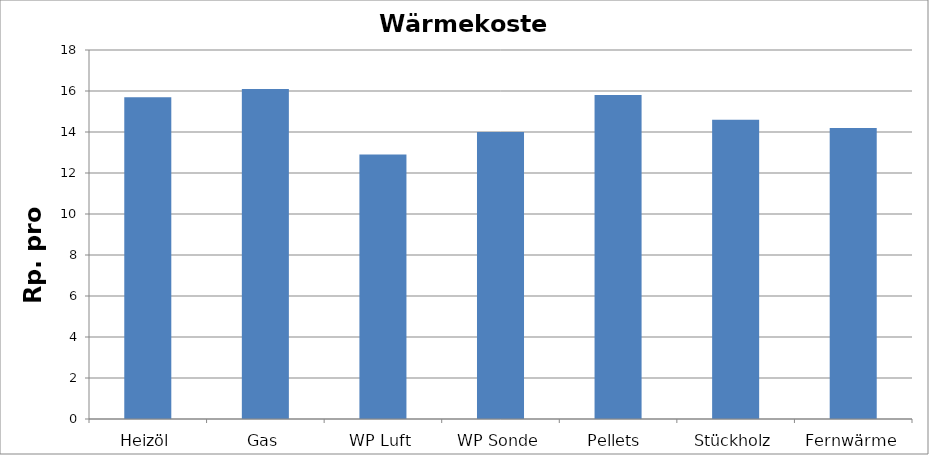
| Category | Wärmekosten [Rp./kWh] |
|---|---|
| Heizöl | 15.7 |
| Gas | 16.1 |
| WP Luft | 12.9 |
| WP Sonde | 14 |
| Pellets  | 15.8 |
| Stückholz | 14.6 |
| Fernwärme | 14.2 |